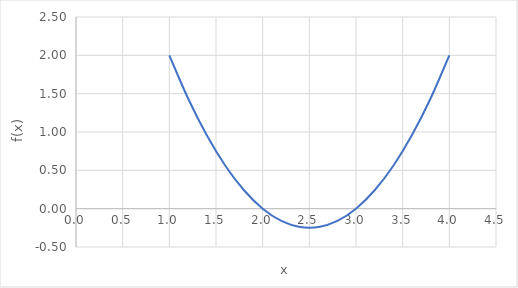
| Category | Series 0 |
|---|---|
| 1.0 | 2 |
| 1.2 | 1.44 |
| 1.4 | 0.96 |
| 1.5999999999999999 | 0.56 |
| 1.7999999999999998 | 0.24 |
| 1.9999999999999998 | 0 |
| 2.1999999999999997 | -0.16 |
| 2.4 | -0.24 |
| 2.6 | -0.24 |
| 2.8000000000000003 | -0.16 |
| 3.0000000000000004 | 0 |
| 3.2000000000000006 | 0.24 |
| 3.400000000000001 | 0.56 |
| 3.600000000000001 | 0.96 |
| 3.800000000000001 | 1.44 |
| 4.000000000000001 | 2 |